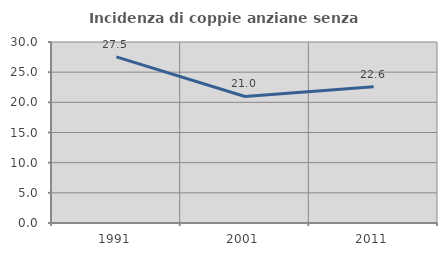
| Category | Incidenza di coppie anziane senza figli  |
|---|---|
| 1991.0 | 27.536 |
| 2001.0 | 20.968 |
| 2011.0 | 22.581 |